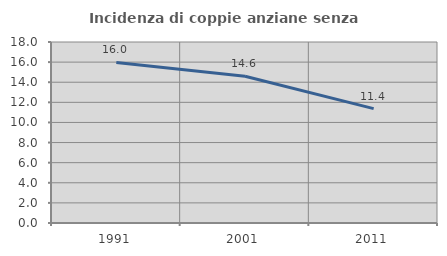
| Category | Incidenza di coppie anziane senza figli  |
|---|---|
| 1991.0 | 15.965 |
| 2001.0 | 14.588 |
| 2011.0 | 11.379 |